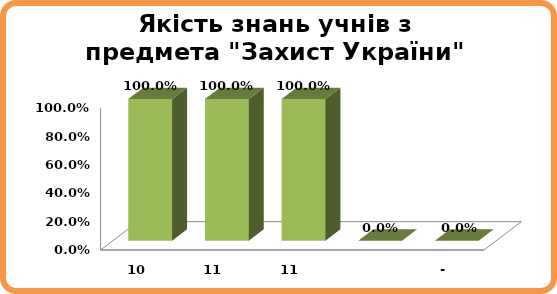
| Category | Series 0 |
|---|---|
| 10 | 1 |
| 11 | 1 |
| 11 | 1 |
|  | 0 |
| - | 0 |